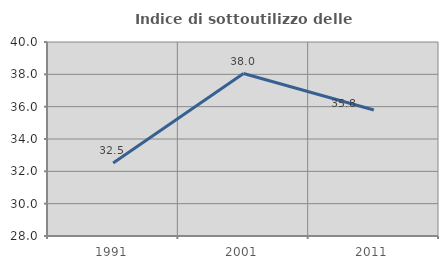
| Category | Indice di sottoutilizzo delle abitazioni  |
|---|---|
| 1991.0 | 32.516 |
| 2001.0 | 38.049 |
| 2011.0 | 35.793 |